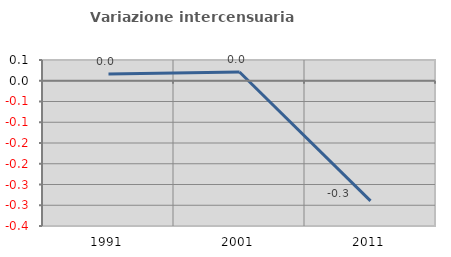
| Category | Variazione intercensuaria annua |
|---|---|
| 1991.0 | 0.016 |
| 2001.0 | 0.021 |
| 2011.0 | -0.29 |